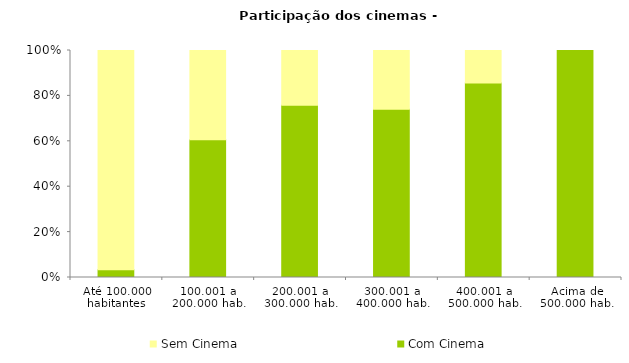
| Category | Com Cinema | Sem Cinema |
|---|---|---|
| Até 100.000 habitantes | 179 | 5103 |
| 100.001 a 200.000 hab. | 91 | 59 |
| 200.001 a 300.000 hab. | 41 | 13 |
| 300.001 a 400.000 hab. | 20 | 7 |
| 400.001 a 500.000 hab. | 12 | 2 |
| Acima de 500.000 hab. | 38 | 0 |